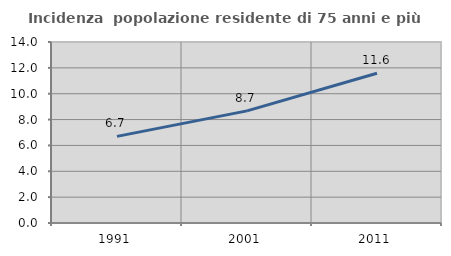
| Category | Incidenza  popolazione residente di 75 anni e più |
|---|---|
| 1991.0 | 6.699 |
| 2001.0 | 8.673 |
| 2011.0 | 11.579 |